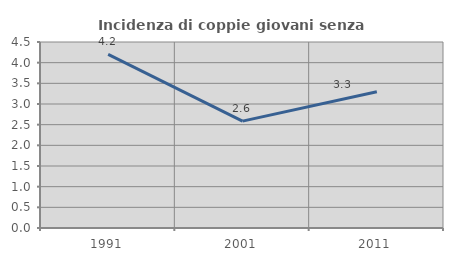
| Category | Incidenza di coppie giovani senza figli |
|---|---|
| 1991.0 | 4.202 |
| 2001.0 | 2.586 |
| 2011.0 | 3.297 |